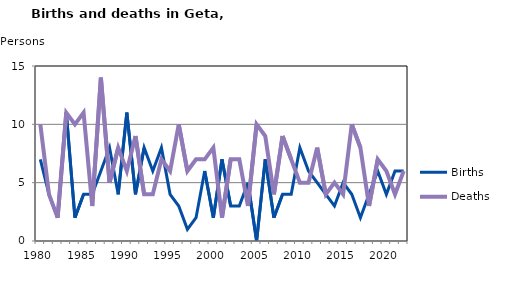
| Category | Births | Deaths |
|---|---|---|
| 1980.0 | 7 | 10 |
| 1981.0 | 4 | 4 |
| 1982.0 | 2 | 2 |
| 1983.0 | 11 | 11 |
| 1984.0 | 2 | 10 |
| 1985.0 | 4 | 11 |
| 1986.0 | 4 | 3 |
| 1987.0 | 6 | 14 |
| 1988.0 | 8 | 5 |
| 1989.0 | 4 | 8 |
| 1990.0 | 11 | 6 |
| 1991.0 | 4 | 9 |
| 1992.0 | 8 | 4 |
| 1993.0 | 6 | 4 |
| 1994.0 | 8 | 7 |
| 1995.0 | 4 | 6 |
| 1996.0 | 3 | 10 |
| 1997.0 | 1 | 6 |
| 1998.0 | 2 | 7 |
| 1999.0 | 6 | 7 |
| 2000.0 | 2 | 8 |
| 2001.0 | 7 | 2 |
| 2002.0 | 3 | 7 |
| 2003.0 | 3 | 7 |
| 2004.0 | 5 | 3 |
| 2005.0 | 0 | 10 |
| 2006.0 | 7 | 9 |
| 2007.0 | 2 | 4 |
| 2008.0 | 4 | 9 |
| 2009.0 | 4 | 7 |
| 2010.0 | 8 | 5 |
| 2011.0 | 6 | 5 |
| 2012.0 | 5 | 8 |
| 2013.0 | 4 | 4 |
| 2014.0 | 3 | 5 |
| 2015.0 | 5 | 4 |
| 2016.0 | 4 | 10 |
| 2017.0 | 2 | 8 |
| 2018.0 | 4 | 3 |
| 2019.0 | 6 | 7 |
| 2020.0 | 4 | 6 |
| 2021.0 | 6 | 4 |
| 2022.0 | 6 | 6 |